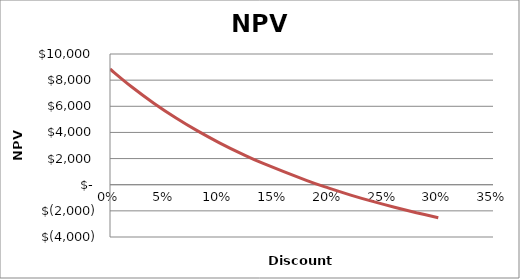
| Category | Series 1 |
|---|---|
| 0.0 | 8850 |
| 0.02 | 7472.753 |
| 0.04 | 6235.896 |
| 0.06 | 5121.934 |
| 0.08 | 4115.888 |
| 0.1 | 3204.891 |
| 0.12 | 2377.854 |
| 0.14 | 1625.19 |
| 0.18 | 310.809 |
| 0.2 | -264.446 |
| 0.22 | -792.697 |
| 0.24 | -1278.781 |
| 0.26 | -1726.951 |
| 0.28 | -2140.957 |
| 0.3 | -2524.11 |